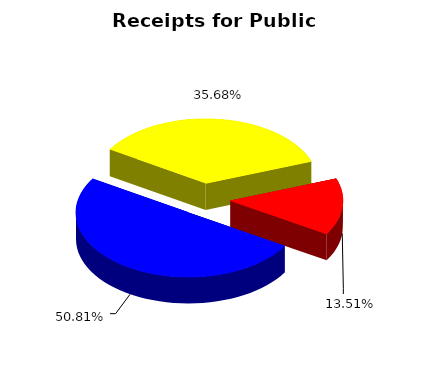
| Category | Series 0 |
|---|---|
| Federal | 0.142 |
| State | 0.501 |
| Local | 0.357 |